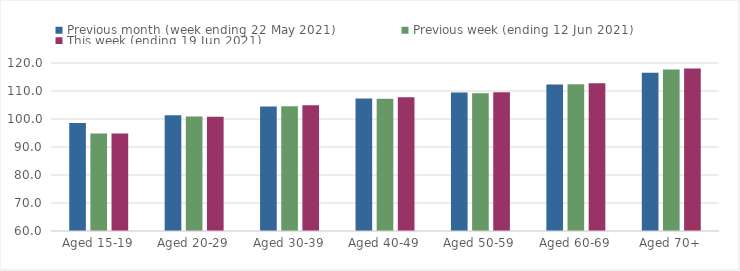
| Category | Previous month (week ending 22 May 2021) | Previous week (ending 12 Jun 2021) | This week (ending 19 Jun 2021) |
|---|---|---|---|
| Aged 15-19 | 98.54 | 94.78 | 94.79 |
| Aged 20-29 | 101.35 | 100.92 | 100.83 |
| Aged 30-39 | 104.45 | 104.57 | 104.94 |
| Aged 40-49 | 107.35 | 107.26 | 107.74 |
| Aged 50-59 | 109.48 | 109.2 | 109.54 |
| Aged 60-69 | 112.31 | 112.4 | 112.78 |
| Aged 70+ | 116.5 | 117.71 | 118.02 |